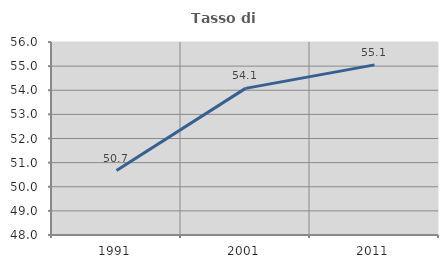
| Category | Tasso di occupazione   |
|---|---|
| 1991.0 | 50.67 |
| 2001.0 | 54.077 |
| 2011.0 | 55.052 |